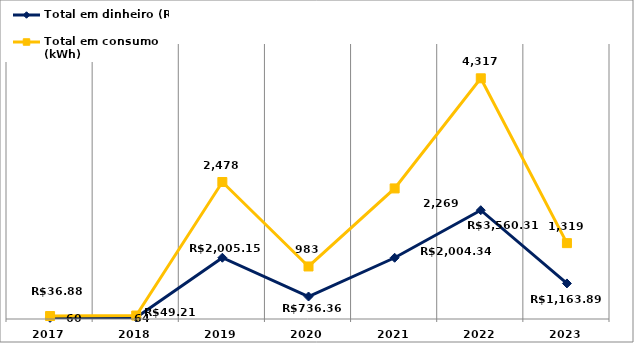
| Category | Total em dinheiro (R$) | Total em consumo (kWh) |
|---|---|---|
| 2017.0 | 36.88 | 60 |
| 2018.0 | 49.21 | 64 |
| 2019.0 | 2005.15 | 2478 |
| 2020.0 | 736.36 | 983 |
| 2021.0 | 2004.34 | 2269 |
| 2022.0 | 3560.31 | 4317 |
| 2023.0 | 1163.89 | 1319 |